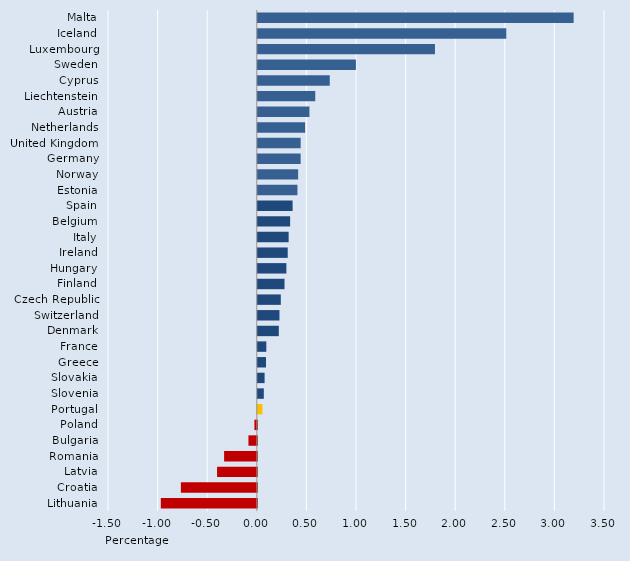
| Category | Series 0 |
|---|---|
| Malta | 3.184 |
| Iceland | 2.505 |
| Luxembourg | 1.786 |
| Sweden | 0.989 |
| Cyprus | 0.725 |
| Liechtenstein | 0.579 |
| Austria | 0.52 |
| Netherlands | 0.477 |
| United Kingdom | 0.432 |
| Germany | 0.432 |
| Norway | 0.407 |
| Estonia | 0.4 |
| Spain | 0.351 |
| Belgium | 0.326 |
| Italy | 0.311 |
| Ireland | 0.302 |
| Hungary | 0.288 |
| Finland | 0.269 |
| Czech Republic | 0.232 |
| Switzerland | 0.218 |
| Denmark | 0.212 |
| France | 0.086 |
| Greece | 0.083 |
| Slovakia | 0.068 |
| Slovenia | 0.061 |
| Portugal | 0.047 |
| Poland | -0.024 |
| Bulgaria | -0.084 |
| Romania | -0.33 |
| Latvia | -0.4 |
| Croatia | -0.765 |
| Lithuania | -0.968 |